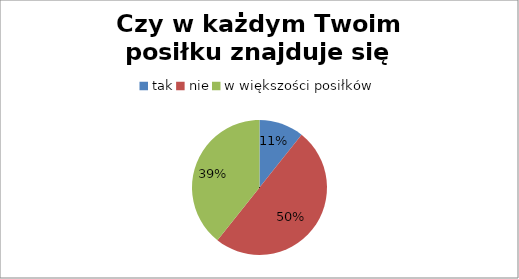
| Category | Czy w każdym Twoim posiłku znajduje się mięso? |
|---|---|
| tak | 3 |
| nie | 14 |
| w większości posiłków | 11 |